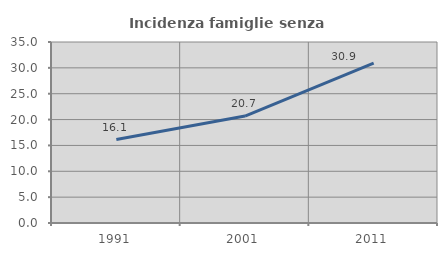
| Category | Incidenza famiglie senza nuclei |
|---|---|
| 1991.0 | 16.129 |
| 2001.0 | 20.682 |
| 2011.0 | 30.917 |